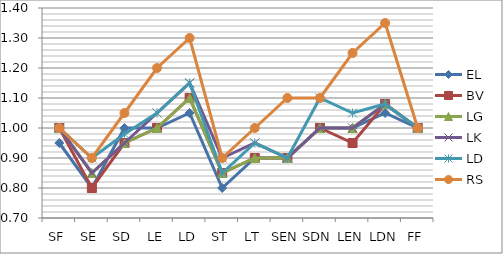
| Category | EL | BV | LG | LK | LD | RS |
|---|---|---|---|---|---|---|
| SF | 0.95 | 1 | 1 | 1 | 1 | 1 |
| SE | 0.8 | 0.8 | 0.85 | 0.85 | 0.9 | 0.9 |
| SD | 1 | 0.95 | 0.95 | 0.95 | 0.98 | 1.05 |
| LE | 1 | 1 | 1 | 1.05 | 1.05 | 1.2 |
| LD | 1.05 | 1.1 | 1.1 | 1.15 | 1.15 | 1.3 |
| ST | 0.8 | 0.85 | 0.85 | 0.9 | 0.85 | 0.9 |
| LT | 0.9 | 0.9 | 0.9 | 0.95 | 0.95 | 1 |
| SEN | 0.9 | 0.9 | 0.9 | 0.9 | 0.9 | 1.1 |
| SDN | 1 | 1 | 1 | 1 | 1.1 | 1.1 |
| LEN | 1 | 0.95 | 1 | 1 | 1.05 | 1.25 |
| LDN | 1.05 | 1.08 | 1.08 | 1.08 | 1.08 | 1.35 |
| FF | 1 | 1 | 1 | 1 | 1 | 1 |